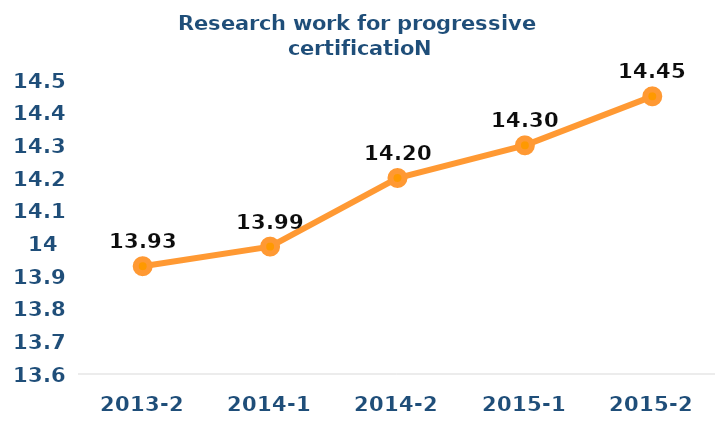
| Category | Series 0 |
|---|---|
| 2013-2 | 13.93 |
| 2014-1 | 13.99 |
| 2014-2 | 14.2 |
| 2015-1 | 14.3 |
| 2015-2 | 14.45 |